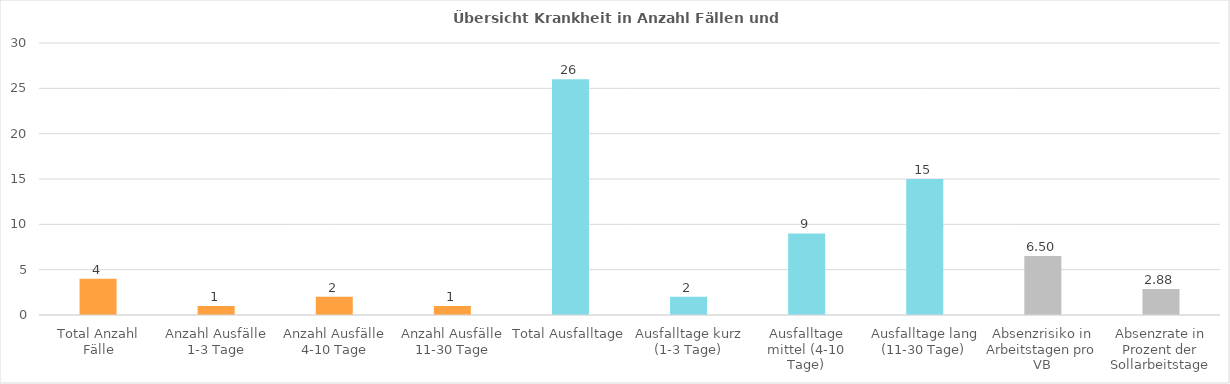
| Category | Krankheit  |
|---|---|
| Total Anzahl Fälle | 4 |
| Anzahl Ausfälle 1-3 Tage | 1 |
| Anzahl Ausfälle 4-10 Tage | 2 |
| Anzahl Ausfälle 11-30 Tage | 1 |
| Total Ausfalltage | 26 |
| Ausfalltage kurz (1-3 Tage) | 2 |
| Ausfalltage mittel (4-10 Tage) | 9 |
| Ausfalltage lang (11-30 Tage) | 15 |
| Absenzrisiko in Arbeitstagen pro VB | 6.5 |
| Absenzrate in Prozent der Sollarbeitstage | 2.876 |